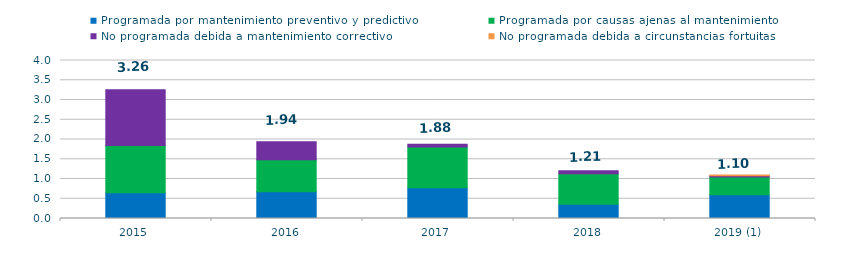
| Category | Programada por mantenimiento preventivo y predictivo | Programada por causas ajenas al mantenimiento  | No programada debida a mantenimiento correctivo  | No programada debida a circunstancias fortuitas  |
|---|---|---|---|---|
| 2015 | 0.65 | 1.2 | 1.41 | 0 |
| 2016 | 0.68 | 0.81 | 0.45 | 0 |
| 2017 | 0.78 | 1.03 | 0.07 | 0 |
| 2018 | 0.36 | 0.77 | 0.08 | 0 |
| 2019 (1) | 0.6 | 0.45 | 0.03 | 0.02 |